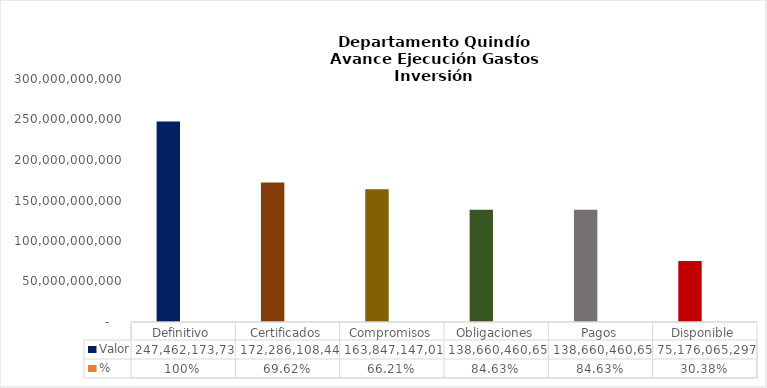
| Category | Valor | % |
|---|---|---|
| Definitivo | 247462173738.3 | 1 |
| Certificados | 172286108441.49 | 0.696 |
| Compromisos | 163847147009.66 | 0.662 |
| Obligaciones | 138660460653.83 | 0.846 |
| Pagos | 138660460653.83 | 0.846 |
|  Disponible  | 75176065296.81 | 0.304 |